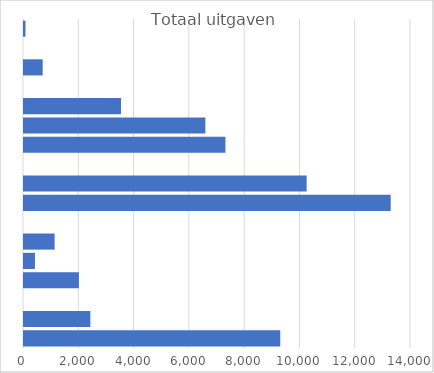
| Category | Totaal uitgaven |
|---|---|
| Bankkosten | 54 |
| Gezondheid | 0 |
| Huis en tuin | 676 |
| Huisdieren | 0 |
| Kinderen | 3510 |
| Kleding | 6561.5 |
| Leuke dingen | 7286.5 |
| Sparen | 0 |
| Vervoer | 10225 |
| Verzorging | 13266 |
| Abonnementen | 0 |
| Belasting | 1107 |
| Contributies | 396 |
| Energie | 1986 |
| Giften | 0 |
| Verzekeringen | 2400 |
| Wonen | 9270 |